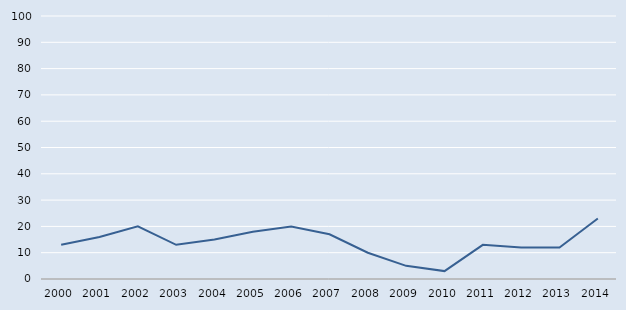
| Category | Series 0 |
|---|---|
| 2000.0 | 13 |
| 2001.0 | 16 |
| 2002.0 | 20 |
| 2003.0 | 13 |
| 2004.0 | 15 |
| 2005.0 | 18 |
| 2006.0 | 20 |
| 2007.0 | 17 |
| 2008.0 | 10 |
| 2009.0 | 5 |
| 2010.0 | 3 |
| 2011.0 | 13 |
| 2012.0 | 12 |
| 2013.0 | 12 |
| 2014.0 | 23 |